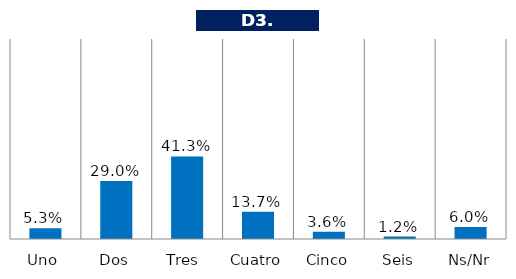
| Category | Series 0 |
|---|---|
| Uno | 0.053 |
| Dos | 0.29 |
| Tres  | 0.413 |
| Cuatro | 0.137 |
| Cinco | 0.036 |
| Seis | 0.012 |
| Ns/Nr | 0.06 |